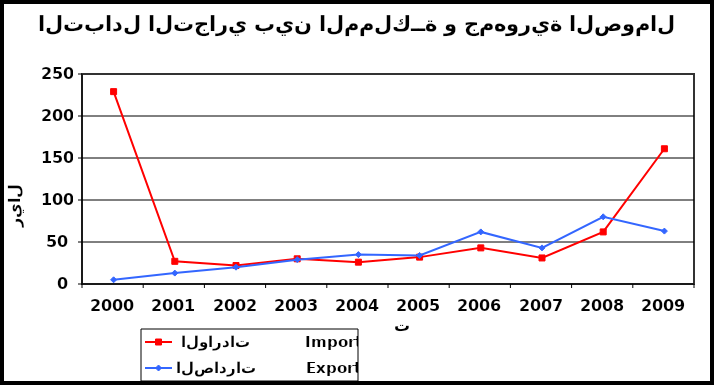
| Category |  الواردات           Import | الصادرات          Export |
|---|---|---|
| 2000.0 | 229 | 5 |
| 2001.0 | 27 | 13 |
| 2002.0 | 22 | 20 |
| 2003.0 | 30 | 29 |
| 2004.0 | 26 | 35 |
| 2005.0 | 32 | 34 |
| 2006.0 | 43 | 62 |
| 2007.0 | 31 | 43 |
| 2008.0 | 62 | 80 |
| 2009.0 | 161 | 63 |